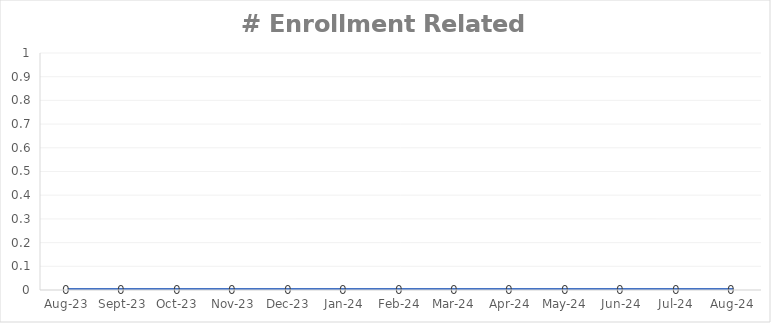
| Category | # Enrollment Related Assists |
|---|---|
| 2023-08-01 | 0 |
| 2023-09-01 | 0 |
| 2023-10-01 | 0 |
| 2023-11-01 | 0 |
| 2023-12-01 | 0 |
| 2024-01-01 | 0 |
| 2024-02-01 | 0 |
| 2024-03-01 | 0 |
| 2024-04-01 | 0 |
| 2024-05-01 | 0 |
| 2024-06-01 | 0 |
| 2024-07-01 | 0 |
| 2024-08-01 | 0 |